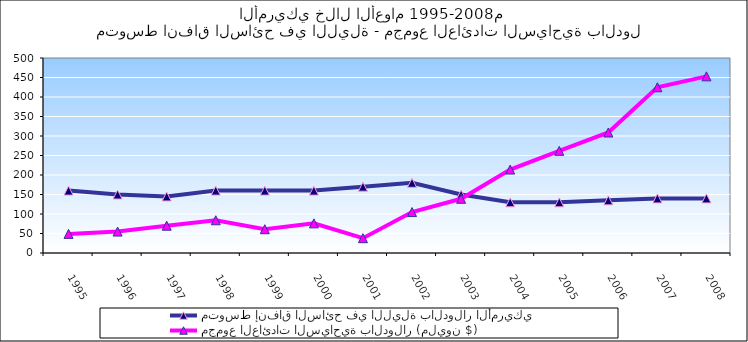
| Category | متوسط إنفاق السائح في الليلة بالدولار الأمريكي | مجموع العائدات السياحية بالدولار (مليون $)  |
|---|---|---|
| 1995.0 | 160 | 49 |
| 1996.0 | 150 | 55 |
| 1997.0 | 145 | 70 |
| 1998.0 | 160 | 84 |
| 1999.0 | 160 | 61 |
| 2000.0 | 160 | 76 |
| 2001.0 | 170 | 38 |
| 2002.0 | 180 | 105 |
| 2003.0 | 150 | 139 |
| 2004.0 | 130 | 214 |
| 2005.0 | 130 | 262 |
| 2006.0 | 135 | 309 |
| 2007.0 | 140 | 425 |
| 2008.0 | 140 | 453 |